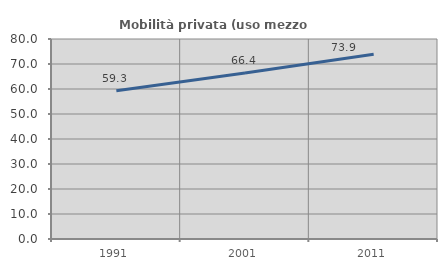
| Category | Mobilità privata (uso mezzo privato) |
|---|---|
| 1991.0 | 59.259 |
| 2001.0 | 66.363 |
| 2011.0 | 73.905 |